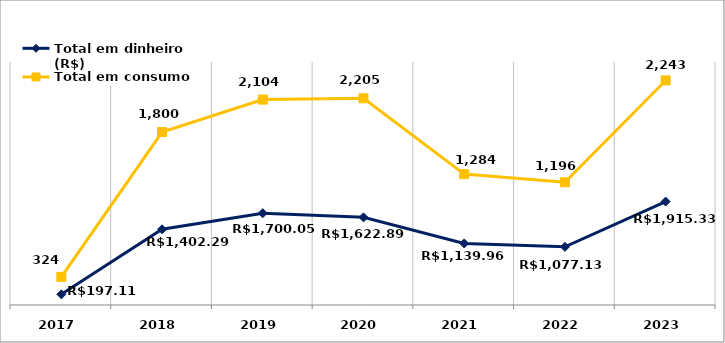
| Category | Total em dinheiro (R$) | Total em consumo (kWh) |
|---|---|---|
| 2017.0 | 197.11 | 324 |
| 2018.0 | 1402.29 | 1800 |
| 2019.0 | 1700.05 | 2104 |
| 2020.0 | 1622.89 | 2205 |
| 2021.0 | 1139.96 | 1284 |
| 2022.0 | 1077.13 | 1196 |
| 2023.0 | 1915.33 | 2243 |